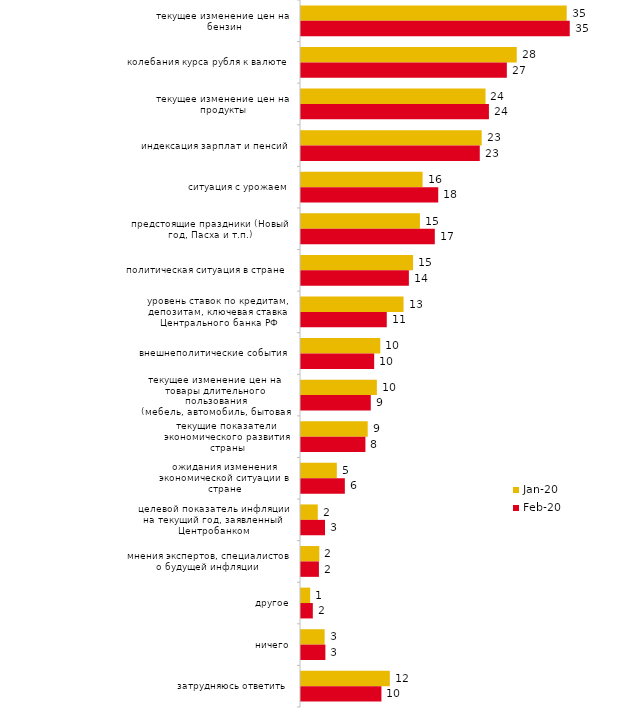
| Category | янв.20 | фев.20 |
|---|---|---|
| текущее изменение цен на бензин | 34.505 | 34.901 |
| колебания курса рубля к валюте | 28.02 | 26.733 |
| текущее изменение цен на продукты | 23.96 | 24.406 |
| индексация зарплат и пенсий | 23.465 | 23.218 |
| ситуация с урожаем | 15.792 | 17.822 |
| предстоящие праздники (Новый год, Пасха и т.п.) | 15.446 | 17.376 |
| политическая ситуация в стране | 14.554 | 14.01 |
| уровень ставок по кредитам, депозитам, ключевая ставка Центрального банка РФ | 13.317 | 11.139 |
| внешнеполитические события | 10.297 | 9.505 |
| текущее изменение цен на товары длительного пользования (мебель, автомобиль, бытовая техника и т.п.) | 9.851 | 9.059 |
| текущие показатели экономического развития страны | 8.663 | 8.366 |
| ожидания изменения экономической ситуации в стране | 4.653 | 5.693 |
| целевой показатель инфляции на текущий год, заявленный Центробанком | 2.178 | 3.119 |
| мнения экспертов, специалистов о будущей инфляции | 2.376 | 2.327 |
| другое | 1.188 | 1.535 |
| ничего | 3.069 | 3.168 |
| затрудняюсь ответить | 11.535 | 10.446 |